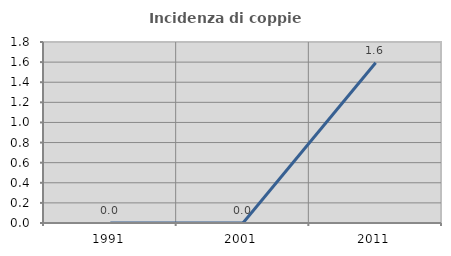
| Category | Incidenza di coppie miste |
|---|---|
| 1991.0 | 0 |
| 2001.0 | 0 |
| 2011.0 | 1.594 |